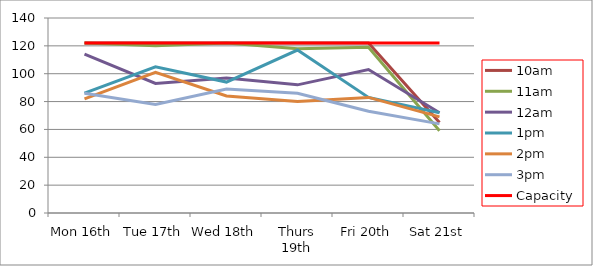
| Category | 9am | 10am | 11am | 12am | 1pm | 2pm | 3pm | 4pm | 5pm | Capacity |
|---|---|---|---|---|---|---|---|---|---|---|
| Mon 16th |  | 122 | 122 | 114 | 86 | 82 | 86 |  |  | 122 |
| Tue 17th |  | 122 | 120 | 93 | 105 | 101 | 78 |  |  | 122 |
| Wed 18th |  | 122 | 122 | 97 | 94 | 84 | 89 |  |  | 122 |
| Thurs 19th |  | 122 | 118 | 92 | 117 | 80 | 86 |  |  | 122 |
| Fri 20th |  | 122 | 119 | 103 | 83 | 83 | 73 |  |  | 122 |
| Sat 21st |  | 65 | 59 | 72 | 72 | 69 | 64 |  |  | 122 |